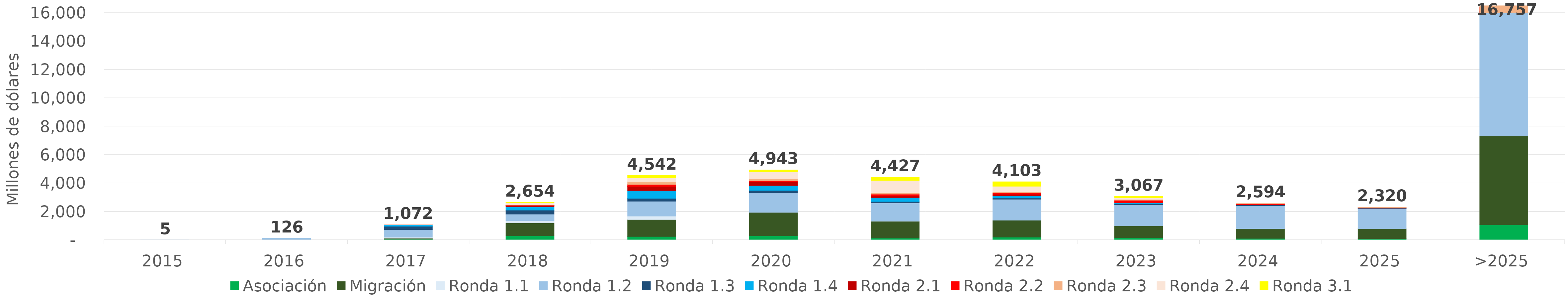
| Category | Asociación | Migración | Ronda 1.1 | Ronda 1.2 | Ronda 1.3 | Ronda 1.4 | Ronda 2.1 | Ronda 2.2 | Ronda 2.3 | Ronda 2.4 | Ronda 3.1 |
|---|---|---|---|---|---|---|---|---|---|---|---|
| 2015 | 0 | 0 | 4.573 | 0.236 | 0 | 0 | 0 | 0 | 0 | 0 | 0 |
| 2016 | 0 | 0 | 16.79 | 108.909 | 0 | 0 | 0 | 0 | 0 | 0 | 0 |
| 2017 | 50.877 | 65.422 | 76.429 | 533.486 | 231.789 | 93.443 | 18.851 | 1.29 | 0.72 | 0 | 0 |
| 2018 | 289.394 | 902.921 | 155.042 | 470.128 | 278.302 | 226.903 | 104.896 | 21.902 | 26.974 | 139.641 | 37.691 |
| 2019 | 241.207 | 1195.818 | 236.68 | 1049.68 | 207.126 | 540.649 | 302.09 | 133.009 | 199.161 | 270.262 | 166.186 |
| 2020 | 284.321 | 1655.641 | 6.736 | 1382.287 | 161.213 | 341.057 | 252.645 | 70.216 | 163.112 | 477.469 | 148.013 |
| 2021 | 127.797 | 1192.243 | 2.229 | 1284.713 | 97.796 | 274.593 | 106.762 | 133.184 | 98.223 | 870.647 | 238.989 |
| 2022 | 194.279 | 1192.976 | 0 | 1478.874 | 77.006 | 171.379 | 103.447 | 87.797 | 76.405 | 397.454 | 323.017 |
| 2023 | 149.166 | 842.772 | 0 | 1490.693 | 76.524 | 59.302 | 0.019 | 172.941 | 64.908 | 104.985 | 105.864 |
| 2024 | 102.681 | 691.937 | 0 | 1611.631 | 57.216 | 10.68 | 0 | 65.107 | 53.145 | 1.529 | 0 |
| 2025 | 89.748 | 692.667 | 0 | 1414.16 | 37.877 | 5.238 | 0 | 35.777 | 44.551 | 0 | 0 |
| >2025 | 1066.13 | 6262.668 | 0 | 8795.067 | 310.453 | 0 | 0 | 95.608 | 226.914 | 0 | 0 |